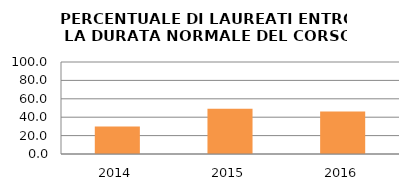
| Category | 2014 2015 2016 |
|---|---|
| 2014.0 | 30 |
| 2015.0 | 49.123 |
| 2016.0 | 46.269 |